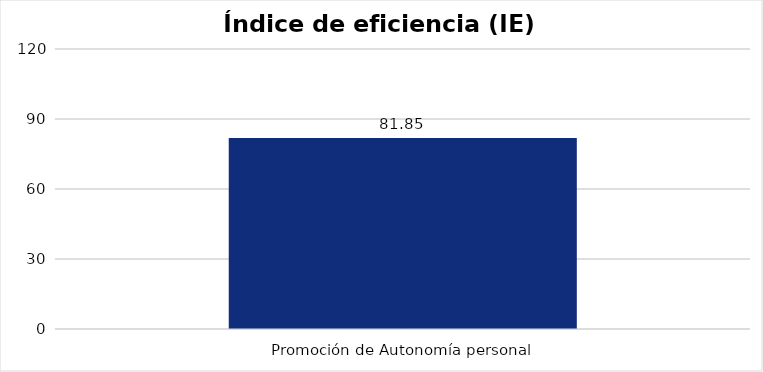
| Category | Índice de eficiencia (IE)  |
|---|---|
| Promoción de Autonomía personal  | 81.847 |